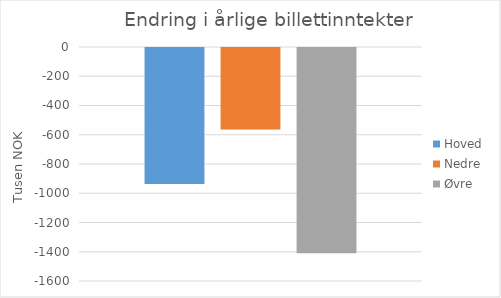
| Category | Hoved | Nedre | Øvre |
|---|---|---|---|
| 0 | -930.345 | -557.999 | -1402.933 |